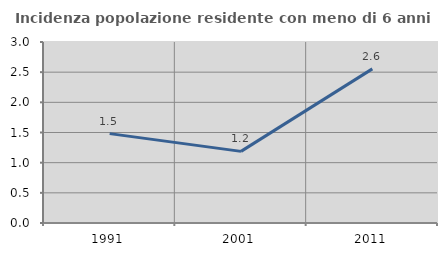
| Category | Incidenza popolazione residente con meno di 6 anni |
|---|---|
| 1991.0 | 1.481 |
| 2001.0 | 1.187 |
| 2011.0 | 2.555 |